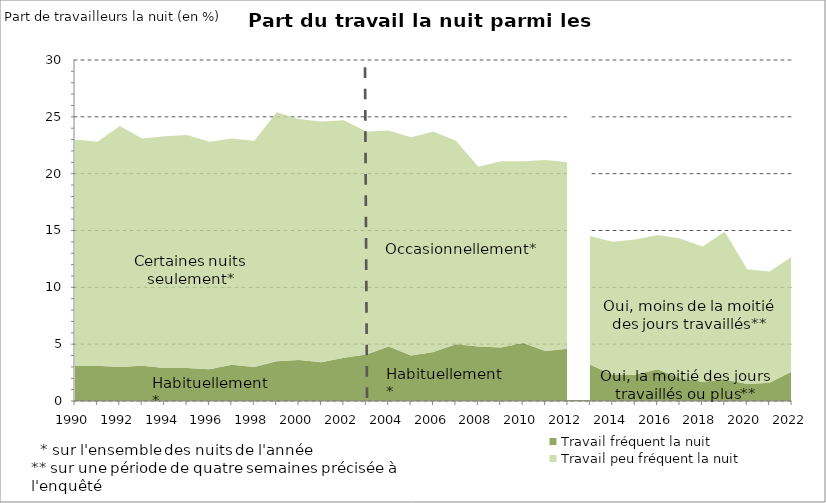
| Category | Travail fréquent la nuit | Travail peu fréquent la nuit |
|---|---|---|
| 1990.0 | 3.1 | 19.9 |
| 1991.0 | 3.1 | 19.7 |
| 1992.0 | 3 | 21.2 |
| 1993.0 | 3.1 | 20 |
| 1994.0 | 2.9 | 20.4 |
| 1995.0 | 2.9 | 20.5 |
| 1996.0 | 2.8 | 20 |
| 1997.0 | 3.2 | 19.9 |
| 1998.0 | 3 | 19.9 |
| 1999.0 | 3.5 | 21.9 |
| 2000.0 | 3.6 | 21.2 |
| 2001.0 | 3.4 | 21.2 |
| 2002.0 | 3.8 | 20.9 |
| 2003.0 | 4.1 | 19.6 |
| 2004.0 | 4.8 | 19 |
| 2005.0 | 4 | 19.2 |
| 2006.0 | 4.3 | 19.4 |
| 2007.0 | 5 | 17.9 |
| 2008.0 | 4.8 | 15.8 |
| 2009.0 | 4.7 | 16.4 |
| 2010.0 | 5.1 | 16 |
| 2011.0 | 4.4 | 16.8 |
| 2012.0 | 4.6 | 16.4 |
| 2013.0 | 3.2 | 11.3 |
| 2014.0 | 2.3 | 11.7 |
| 2015.0 | 2.3 | 11.9 |
| 2016.0 | 2.8 | 11.8 |
| 2017.0 | 2 | 12.3 |
| 2018.0 | 1.7 | 11.9 |
| 2019.0 | 1.9 | 13 |
| 2020.0 | 1.5 | 10.1 |
| 2021.0 | 1.6 | 9.8 |
| 2022.0 | 2.6 | 10.1 |